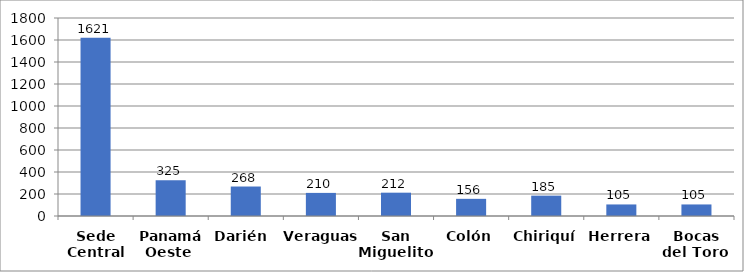
| Category | Series 0 |
|---|---|
| Sede Central | 1621 |
| Panamá Oeste  | 325 |
| Darién  | 268 |
| Veraguas | 210 |
| San Miguelito  | 212 |
| Colón | 156 |
| Chiriquí | 185 |
| Herrera | 105 |
| Bocas del Toro  | 105 |